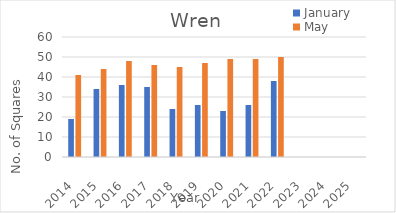
| Category | January | May |
|---|---|---|
| 2014.0 | 19 | 41 |
| 2015.0 | 34 | 44 |
| 2016.0 | 36 | 48 |
| 2017.0 | 35 | 46 |
| 2018.0 | 24 | 45 |
| 2019.0 | 26 | 47 |
| 2020.0 | 23 | 49 |
| 2021.0 | 26 | 49 |
| 2022.0 | 38 | 50 |
| 2023.0 | 0 | 0 |
| 2024.0 | 0 | 0 |
| 2025.0 | 0 | 0 |